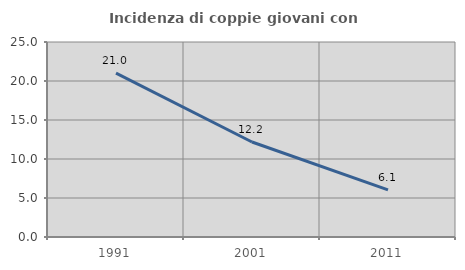
| Category | Incidenza di coppie giovani con figli |
|---|---|
| 1991.0 | 21.012 |
| 2001.0 | 12.183 |
| 2011.0 | 6.051 |